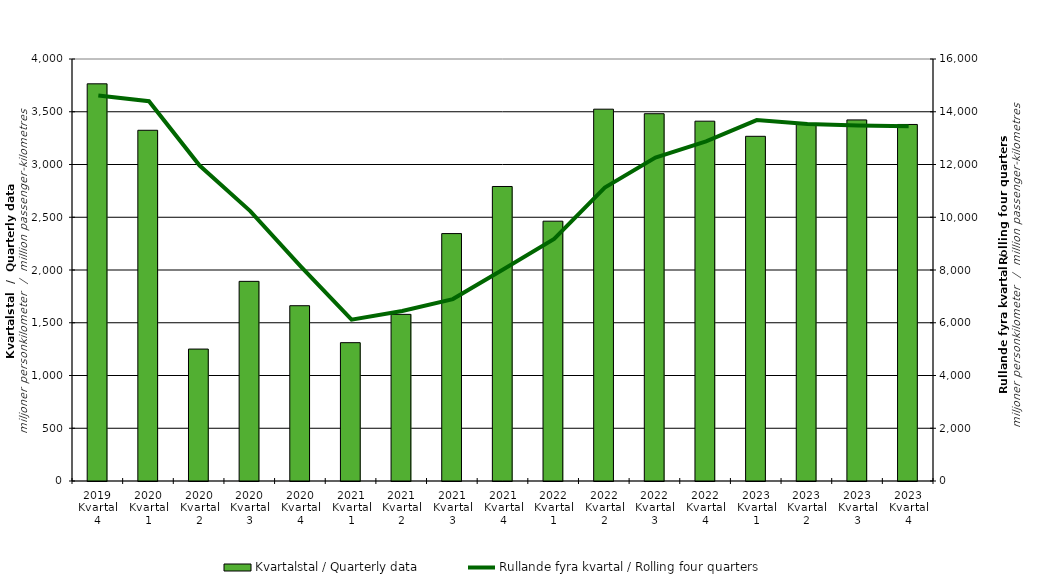
| Category | Kvartalstal / Quarterly data |
|---|---|
| 2019 Kvartal 4 | 3764.759 |
| 2020 Kvartal 1 | 3324.383 |
| 2020 Kvartal 2 | 1250.488 |
| 2020 Kvartal 3 | 1892.351 |
| 2020 Kvartal 4 | 1661.523 |
| 2021 Kvartal 1 | 1311.197 |
| 2021 Kvartal 2 | 1579.614 |
| 2021 Kvartal 3 | 2345.169 |
| 2021 Kvartal 4 | 2791.509 |
| 2022 Kvartal 1 | 2462.735 |
| 2022 Kvartal 2 | 3524.434 |
| 2022 Kvartal 3 | 3481.38 |
| 2022 Kvartal 4 | 3410.614 |
| 2023 Kvartal 1 | 3267.284 |
| 2023 Kvartal 2 | 3379.95 |
| 2023 Kvartal 3 | 3422.569 |
| 2023 Kvartal 4 | 3379.464 |